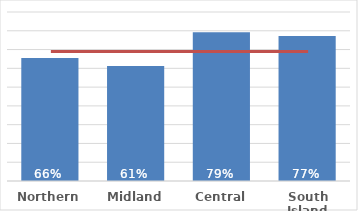
| Category | Māori |
|---|---|
| Northern | 0.655 |
| Midland | 0.612 |
| Central | 0.792 |
| South Island | 0.772 |